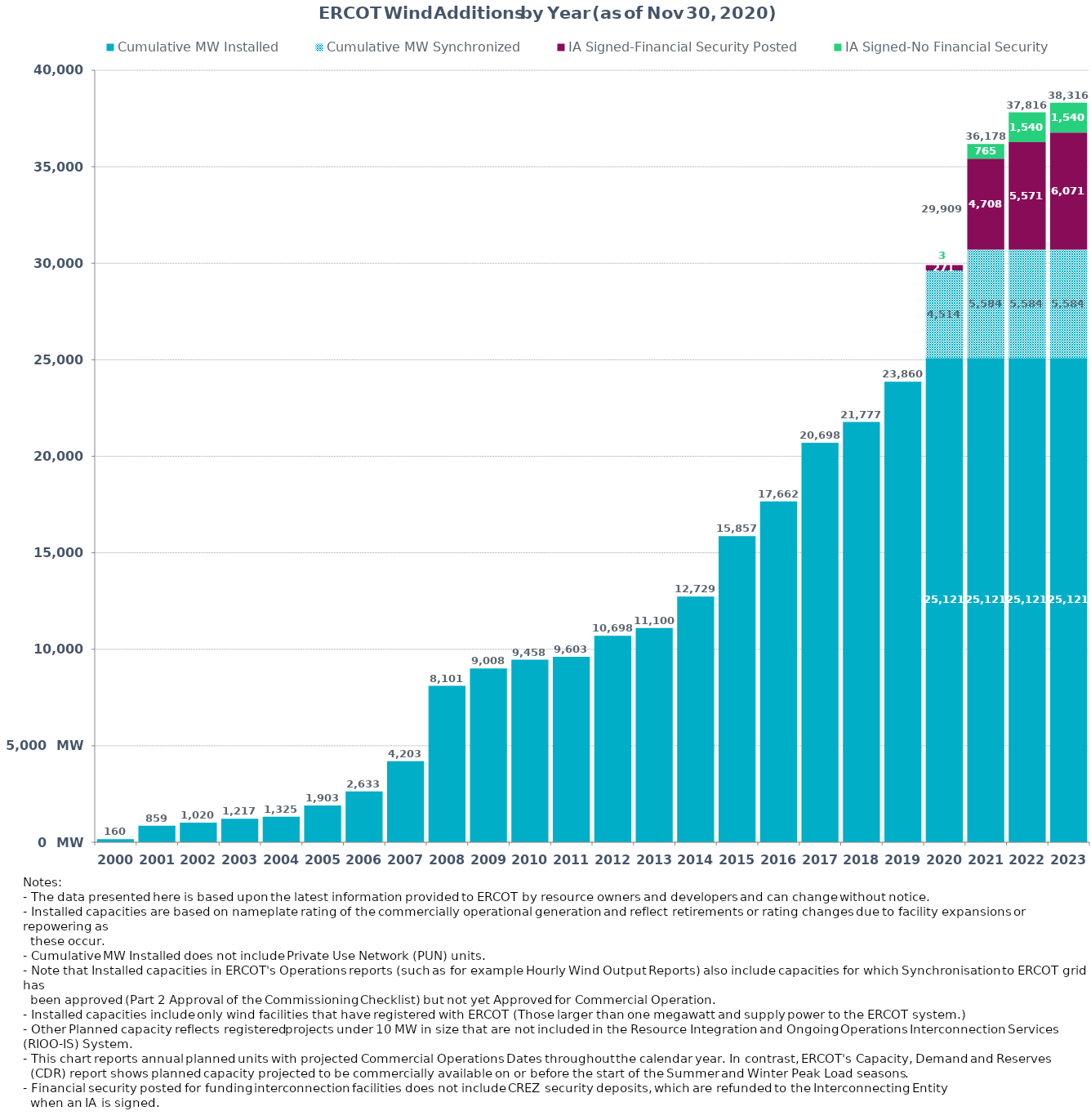
| Category | Cumulative MW Installed | Cumulative MW Synchronized | IA Signed-Financial Security Posted  | IA Signed-No Financial Security  | Other Planned | Cumulative Installed and Planned |
|---|---|---|---|---|---|---|
| 2000.0 | 160.37 | 0 | 0 | 0 | 0 | 160.37 |
| 2001.0 | 859.29 | 0 | 0 | 0 | 0 | 859.29 |
| 2002.0 | 1019.79 | 0 | 0 | 0 | 0 | 1019.79 |
| 2003.0 | 1217.29 | 0 | 0 | 0 | 0 | 1217.29 |
| 2004.0 | 1325.29 | 0 | 0 | 0 | 0 | 1325.29 |
| 2005.0 | 1902.69 | 0 | 0 | 0 | 0 | 1902.69 |
| 2006.0 | 2633.39 | 0 | 0 | 0 | 0 | 2633.39 |
| 2007.0 | 4203.41 | 0 | 0 | 0 | 0 | 4203.41 |
| 2008.0 | 8101.01 | 0 | 0 | 0 | 0 | 8101.01 |
| 2009.0 | 9007.57 | 0 | 0 | 0 | 0 | 9007.57 |
| 2010.0 | 9458.49 | 0 | 0 | 0 | 0 | 9458.49 |
| 2011.0 | 9603.49 | 0 | 0 | 0 | 0 | 9603.49 |
| 2012.0 | 10698.35 | 0 | 0 | 0 | 0 | 10698.35 |
| 2013.0 | 11100.05 | 0 | 0 | 0 | 0 | 11100.05 |
| 2014.0 | 12728.93 | 0 | 0 | 0 | 0 | 12728.93 |
| 2015.0 | 15857.48 | 0 | 0 | 0 | 0 | 15857.48 |
| 2016.0 | 17662.45 | 0 | 0 | 0 | 0 | 17662.45 |
| 2017.0 | 20697.84 | 0 | 0 | 0 | 0 | 20697.84 |
| 2018.0 | 21777 | 0 | 0 | 0 | 0 | 21777 |
| 2019.0 | 23860 | 0 | 0 | 0 | 0 | 23860 |
| 2020.0 | 25120.58 | 4514 | 271 | 3 | 0 | 29908.58 |
| 2021.0 | 25120.58 | 5584.43 | 4707.8 | 765.16 | 0 | 36177.97 |
| 2022.0 | 25120.58 | 5584.43 | 5571.24 | 1540 | 0 | 37816.25 |
| 2023.0 | 25120.58 | 5584.43 | 6071.44 | 1540 | 0 | 38316.45 |